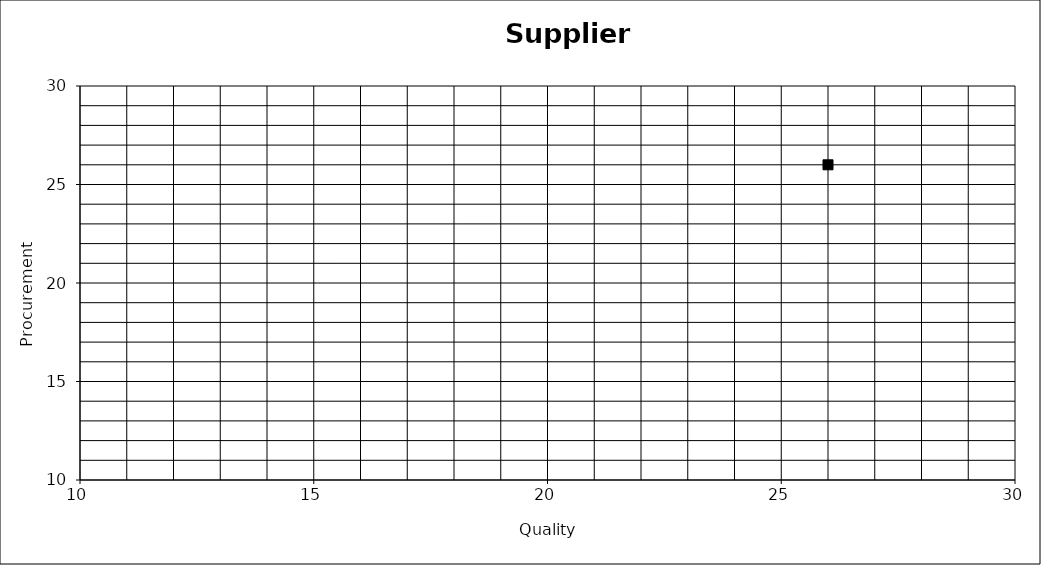
| Category | Series 0 |
|---|---|
| 26.0 | 26 |